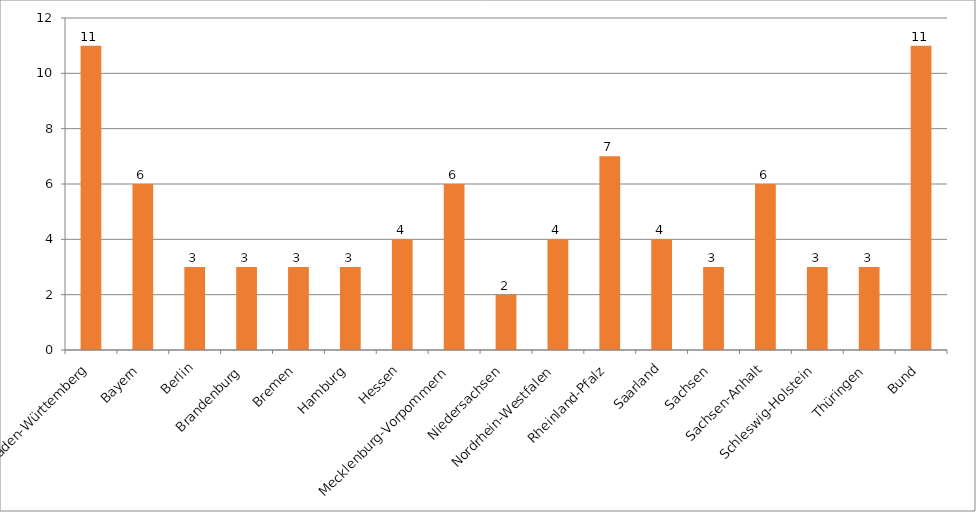
| Category | Series 0 |
|---|---|
| Baden-Württemberg | 11 |
| Bayern | 6 |
| Berlin | 3 |
| Brandenburg | 3 |
| Bremen | 3 |
| Hamburg | 3 |
| Hessen | 4 |
| Mecklenburg-Vorpommern | 6 |
| Niedersachsen | 2 |
| Nordrhein-Westfalen | 4 |
| Rheinland-Pfalz | 7 |
| Saarland | 4 |
| Sachsen | 3 |
| Sachsen-Anhalt | 6 |
| Schleswig-Holstein | 3 |
| Thüringen | 3 |
| Bund | 11 |